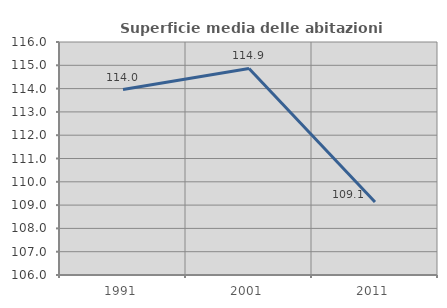
| Category | Superficie media delle abitazioni occupate |
|---|---|
| 1991.0 | 113.96 |
| 2001.0 | 114.864 |
| 2011.0 | 109.129 |